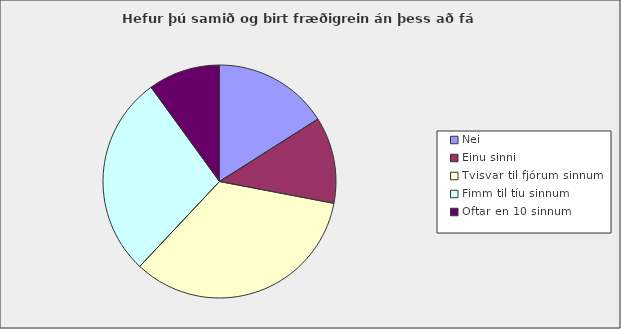
| Category | Series 0 |
|---|---|
| Nei | 0.16 |
| Einu sinni | 0.12 |
| Tvisvar til fjórum sinnum | 0.34 |
| Fimm til tíu sinnum | 0.28 |
| Oftar en 10 sinnum | 0.1 |